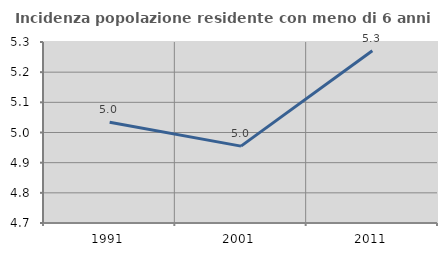
| Category | Incidenza popolazione residente con meno di 6 anni |
|---|---|
| 1991.0 | 5.034 |
| 2001.0 | 4.955 |
| 2011.0 | 5.271 |